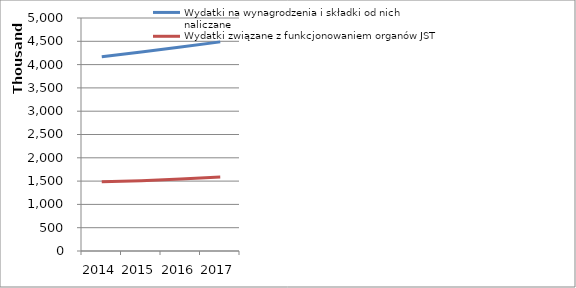
| Category | Wydatki na wynagrodzenia i składki od nich naliczane | Wydatki związane z funkcjonowaniem organów JST |
|---|---|---|
| 2014.0 | 4167113 | 1487583 |
| 2015.0 | 4271290 | 1509400 |
| 2016.0 | 4378000 | 1547135 |
| 2017.0 | 4487450 | 1585800 |